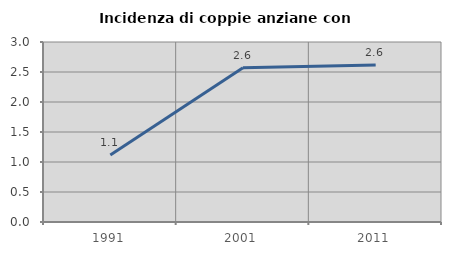
| Category | Incidenza di coppie anziane con figli |
|---|---|
| 1991.0 | 1.117 |
| 2001.0 | 2.569 |
| 2011.0 | 2.616 |